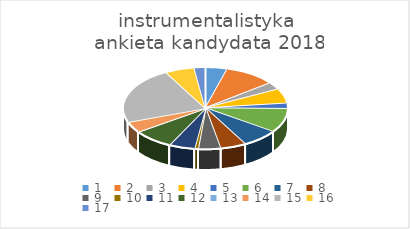
| Category | Series 0 |
|---|---|
| 0 | 6 |
| 1 | 14 |
| 2 | 4 |
| 3 | 8 |
| 4 | 3 |
| 5 | 13 |
| 6 | 10 |
| 7 | 7 |
| 8 | 6 |
| 9 | 1 |
| 10 | 7 |
| 11 | 11 |
| 12 | 0 |
| 13 | 6 |
| 14 | 31 |
| 15 | 8 |
| 16 | 3 |